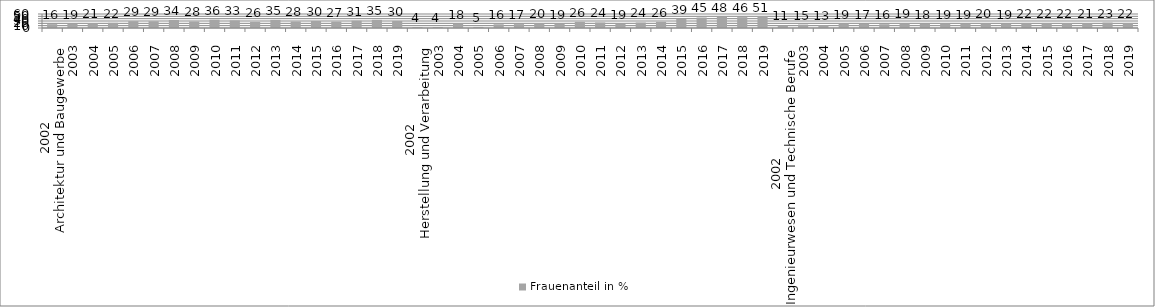
| Category | Frauenanteil in % |
|---|---|
| 0 | 16.471 |
| 1 | 19.048 |
| 2 | 20.69 |
| 3 | 22.43 |
| 4 | 29.258 |
| 5 | 28.862 |
| 6 | 34.188 |
| 7 | 27.933 |
| 8 | 35.689 |
| 9 | 32.734 |
| 10 | 26.449 |
| 11 | 34.783 |
| 12 | 27.946 |
| 13 | 30.086 |
| 14 | 27.322 |
| 15 | 31.332 |
| 16 | 34.862 |
| 17 | 30.193 |
| 18 | 4 |
| 19 | 4.167 |
| 20 | 18.182 |
| 21 | 4.545 |
| 22 | 16 |
| 23 | 16.667 |
| 24 | 20.455 |
| 25 | 18.627 |
| 26 | 26.19 |
| 27 | 23.81 |
| 28 | 18.519 |
| 29 | 23.622 |
| 30 | 26.4 |
| 31 | 39.247 |
| 32 | 45.045 |
| 33 | 47.909 |
| 34 | 46.474 |
| 35 | 50.534 |
| 36 | 11.157 |
| 37 | 14.595 |
| 38 | 12.614 |
| 39 | 19.075 |
| 40 | 17.49 |
| 41 | 16.227 |
| 42 | 19.378 |
| 43 | 17.807 |
| 44 | 19.239 |
| 45 | 19.185 |
| 46 | 20.371 |
| 47 | 18.951 |
| 48 | 21.721 |
| 49 | 21.638 |
| 50 | 21.55 |
| 51 | 21.111 |
| 52 | 23.335 |
| 53 | 21.712 |